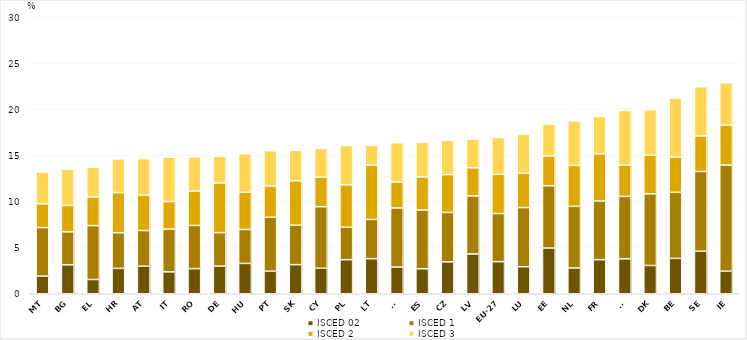
| Category | ISCED 02 | ISCED 1 | ISCED 2 | ISCED 3 |
|---|---|---|---|---|
| MT | 1.908 | 5.254 | 2.586 | 3.433 |
| BG | 3.134 | 3.573 | 2.856 | 3.942 |
| EL | 1.543 | 5.836 | 3.105 | 3.209 |
| HR | 2.748 | 3.86 | 4.349 | 3.651 |
| AT | 2.983 | 3.864 | 3.837 | 3.95 |
| IT | 2.373 | 4.632 | 2.98 | 4.793 |
| RO | 2.722 | 4.677 | 3.718 | 3.72 |
| DE | 2.996 | 3.625 | 5.385 | 2.884 |
| HU | 3.285 | 3.672 | 4.031 | 4.174 |
| PT | 2.439 | 5.847 | 3.389 | 3.82 |
| SK | 3.151 | 4.269 | 4.818 | 3.29 |
| CY | 2.765 | 6.666 | 3.183 | 3.114 |
| PL | 3.691 | 3.514 | 4.595 | 4.254 |
| LT | 3.8 | 4.245 | 5.89 | 2.136 |
| SI | 2.894 | 6.403 | 2.806 | 4.247 |
| ES | 2.708 | 6.353 | 3.596 | 3.74 |
| CZ | 3.455 | 5.348 | 4.11 | 3.688 |
| LV | 4.307 | 6.293 | 3.047 | 3.109 |
| EU-27 | 3.478 | 5.21 | 4.249 | 3.992 |
| LU | 2.928 | 6.404 | 3.715 | 4.248 |
| EE | 4.95 | 6.75 | 3.217 | 3.445 |
| NL | 2.789 | 6.675 | 4.435 | 4.824 |
| FR | 3.691 | 6.357 | 5.119 | 4.027 |
| FI | 3.787 | 6.754 | 3.378 | 5.922 |
| DK | 3.061 | 7.767 | 4.175 | 4.927 |
| BE | 3.832 | 7.149 | 3.822 | 6.373 |
| SE | 4.601 | 8.639 | 3.855 | 5.32 |
| IE | 2.444 | 11.489 | 4.336 | 4.584 |